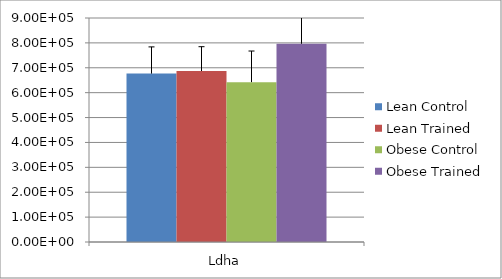
| Category | Lean Control | Lean Trained | Obese Control | Obese Trained |
|---|---|---|---|---|
| Ldha | 676561.111 | 686833.333 | 642333.333 | 796333.333 |